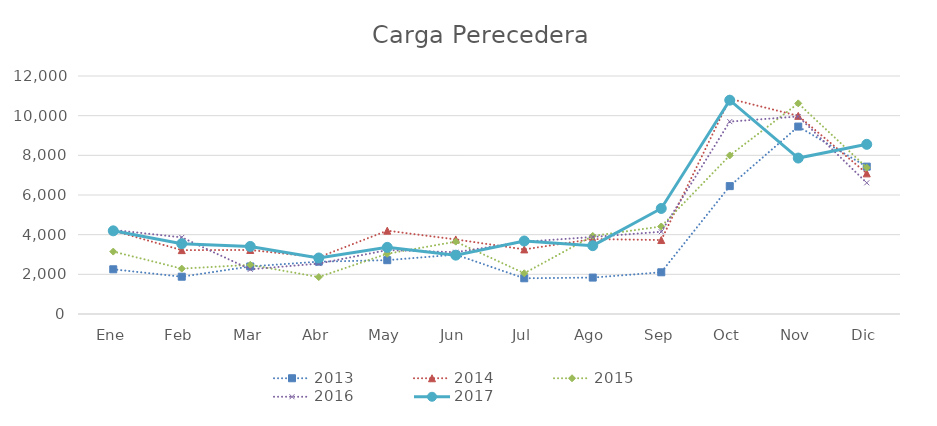
| Category | 2013 | 2014 | 2015 | 2016 | 2017 |
|---|---|---|---|---|---|
| Ene | 2254 | 4205 | 3146.777 | 4239 | 4193 |
| Feb | 1880 | 3220 | 2288.184 | 3864 | 3543 |
| Mar | 2397 | 3228 | 2478 | 2252 | 3406 |
| Abr | 2639 | 2860 | 1863 | 2542 | 2825 |
| May | 2714 | 4201 | 3038 | 3223 | 3360 |
| Jun | 2994 | 3760 | 3648 | 3115 | 2967 |
| Jul | 1801 | 3257 | 2054 | 3644 | 3680 |
| Ago | 1836 | 3778.379 | 3935 | 3882 | 3445 |
| Sep | 2103 | 3728.936 | 4412 | 4147 | 5321 |
| Oct | 6448 | 10853.548 | 7995 | 9701 | 10781 |
| Nov | 9450 | 9991 | 10620 | 9959 | 7863 |
| Dic | 7430 | 7090.696 | 7381 | 6614 | 8555 |